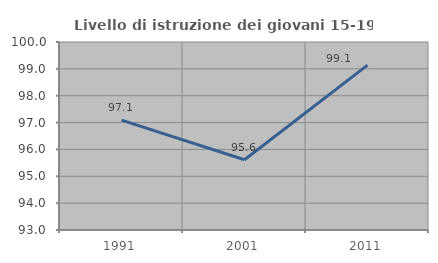
| Category | Livello di istruzione dei giovani 15-19 anni |
|---|---|
| 1991.0 | 97.093 |
| 2001.0 | 95.614 |
| 2011.0 | 99.138 |